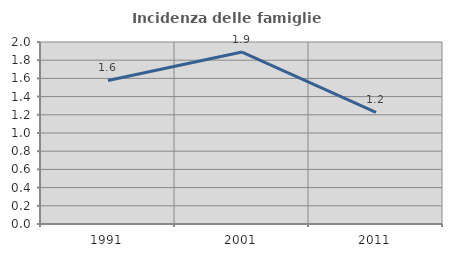
| Category | Incidenza delle famiglie numerose |
|---|---|
| 1991.0 | 1.577 |
| 2001.0 | 1.89 |
| 2011.0 | 1.226 |